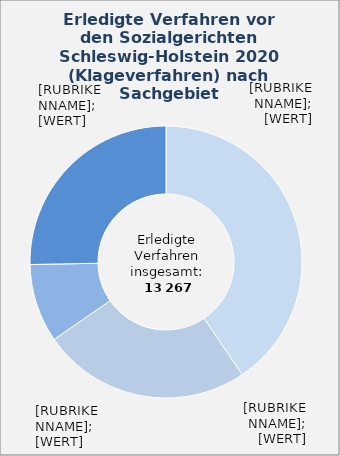
| Category | in Prozent |
|---|---|
| Krankenversicherung | 0.405 |
| Angelegenheiten nach dem SGB II | 0.248 |
| Rentenversicherung | 0.093 |
| Übrige Sachgebiete¹  | 0.253 |